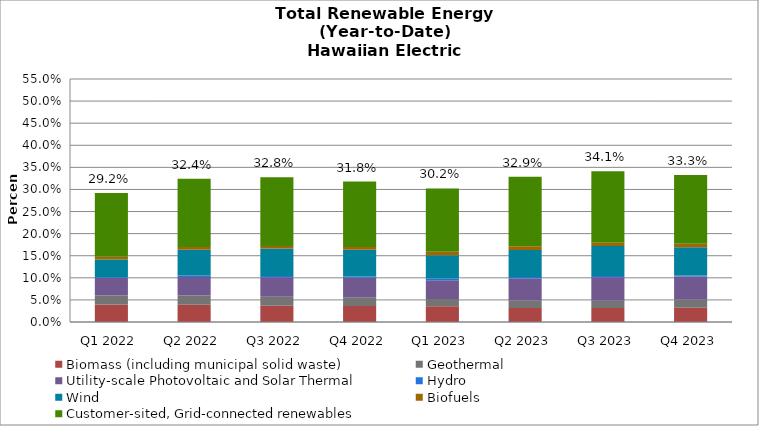
| Category | Biomass (including municipal solid waste) | Geothermal | Utility-scale Photovoltaic and Solar Thermal | Hydro | Wind | Biofuels | Customer-sited, Grid-connected renewables |
|---|---|---|---|---|---|---|---|
| Q1 2022 | 0.039 | 0.02 | 0.04 | 0.002 | 0.04 | 0.006 | 0.145 |
| Q2 2022 | 0.039 | 0.021 | 0.041 | 0.004 | 0.058 | 0.006 | 0.154 |
| Q3 2022 | 0.037 | 0.02 | 0.044 | 0.003 | 0.062 | 0.006 | 0.156 |
| Q4 2022 | 0.036 | 0.02 | 0.044 | 0.003 | 0.061 | 0.006 | 0.148 |
| Q1 2023 | 0.035 | 0.017 | 0.042 | 0.004 | 0.052 | 0.008 | 0.143 |
| Q2 2023 | 0.032 | 0.017 | 0.049 | 0.004 | 0.061 | 0.008 | 0.158 |
| Q3 2023 | 0.032 | 0.016 | 0.053 | 0.003 | 0.068 | 0.008 | 0.162 |
| Q4 2023 | 0.032 | 0.019 | 0.052 | 0.003 | 0.064 | 0.008 | 0.156 |